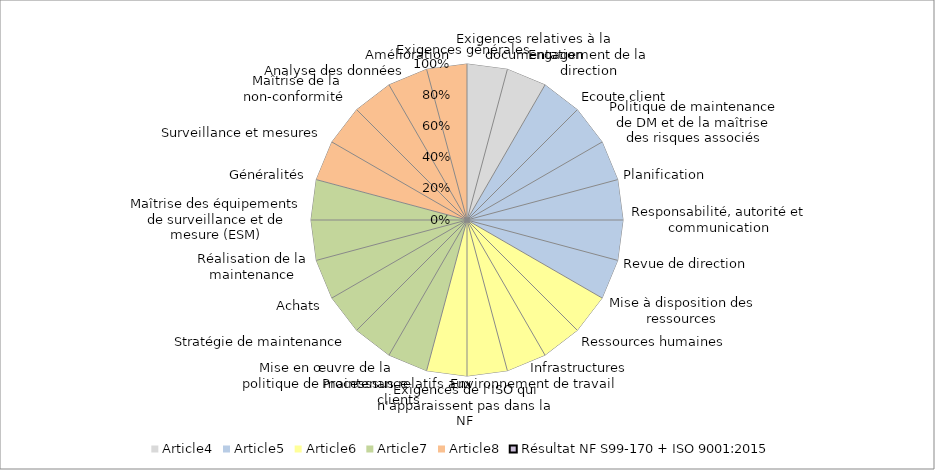
| Category | Article4 | Article5 | Article6 | Article7 | Article8 | Résultat NF S99-170 + ISO 9001:2015 |
|---|---|---|---|---|---|---|
| 0 | 1 | 0 | 0 | 0 | 1 | 0 |
| 1 | 1 | 0 | 0 | 0 | 0 | 0 |
| 2 | 1 | 1 | 0 | 0 | 0 | 0 |
| 3 | 0 | 1 | 0 | 0 | 0 | 0 |
| 4 | 0 | 1 | 0 | 0 | 0 | 0 |
| 5 | 0 | 1 | 0 | 0 | 0 | 0 |
| 6 | 0 | 1 | 0 | 0 | 0 | 0 |
| 7 | 0 | 1 | 0 | 0 | 0 | 0 |
| 8 | 0 | 1 | 1 | 0 | 0 | 0 |
| 9 | 0 | 0 | 1 | 0 | 0 | 0 |
| 10 | 0 | 0 | 1 | 0 | 0 | 0 |
| 11 | 0 | 0 | 1 | 0 | 0 | 0 |
| 12 | 0 | 0 | 1 | 0 | 0 | 0 |
| 13 | 0 | 0 | 1 | 1 | 0 | 0 |
| 14 | 0 | 0 | 0 | 1 | 0 | 0 |
| 15 | 0 | 0 | 0 | 1 | 0 | 0 |
| 16 | 0 | 0 | 0 | 1 | 0 | 0 |
| 17 | 0 | 0 | 0 | 1 | 0 | 0 |
| 18 | 0 | 0 | 0 | 1 | 0 | 0 |
| 19 | 0 | 0 | 0 | 1 | 1 | 0 |
| 20 | 0 | 0 | 0 | 0 | 1 | 0 |
| 21 | 0 | 0 | 0 | 0 | 1 | 0 |
| 22 | 0 | 0 | 0 | 0 | 1 | 0 |
| 23 | 0 | 0 | 0 | 0 | 1 | 0 |